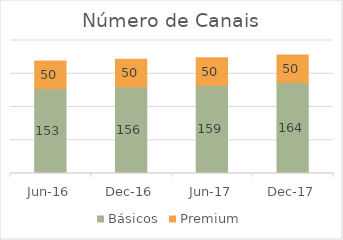
| Category | Básicos | Premium |
|---|---|---|
| 2016-06-01 | 153 | 50 |
| 2016-12-01 | 156 | 50 |
| 2017-06-01 | 159 | 50 |
| 2017-12-01 | 164 | 50 |